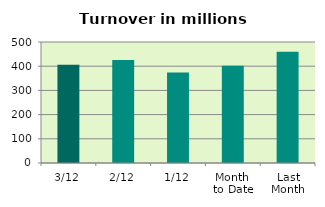
| Category | Series 0 |
|---|---|
| 3/12 | 406.118 |
| 2/12 | 425.678 |
| 1/12 | 374.291 |
| Month 
to Date | 402.029 |
| Last
Month | 459.961 |